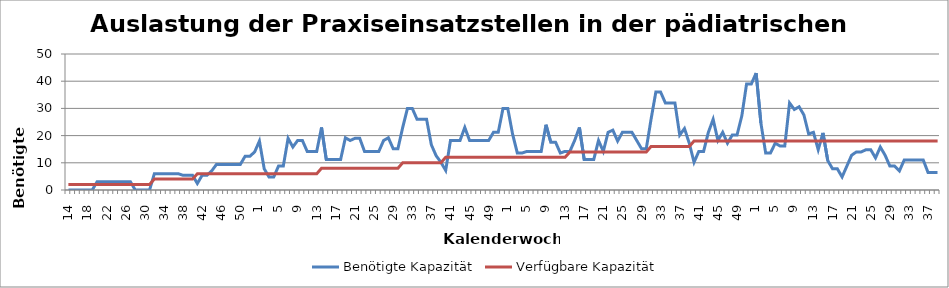
| Category | Benötigte Kapazität | Verfügbare Kapazität |
|---|---|---|
| 14.0 | 0 | 2 |
| 15.0 | 0 | 2 |
| 16.0 | 0 | 2 |
| 17.0 | 0 | 2 |
| 18.0 | 0 | 2 |
| 19.0 | 0 | 2 |
| 20.0 | 3 | 2 |
| 21.0 | 3 | 2 |
| 22.0 | 3 | 2 |
| 23.0 | 3 | 2 |
| 24.0 | 3 | 2 |
| 25.0 | 3 | 2 |
| 26.0 | 3 | 2 |
| 27.0 | 3 | 2 |
| 28.0 | 0 | 2 |
| 29.0 | 0 | 2 |
| 30.0 | 0 | 2 |
| 31.0 | 0 | 2 |
| 32.0 | 6 | 4 |
| 33.0 | 6 | 4 |
| 34.0 | 6 | 4 |
| 35.0 | 6 | 4 |
| 36.0 | 6 | 4 |
| 37.0 | 6 | 4 |
| 38.0 | 5.4 | 4 |
| 39.0 | 5.4 | 4 |
| 40.0 | 5.4 | 4 |
| 41.0 | 2.4 | 6 |
| 42.0 | 5.4 | 6 |
| 43.0 | 5.4 | 6 |
| 44.0 | 7 | 6 |
| 45.0 | 9.4 | 6 |
| 46.0 | 9.4 | 6 |
| 47.0 | 9.4 | 6 |
| 48.0 | 9.4 | 6 |
| 49.0 | 9.4 | 6 |
| 50.0 | 9.4 | 6 |
| 51.0 | 12.4 | 6 |
| 52.0 | 12.4 | 6 |
| 53.0 | 14 | 6 |
| 1.0 | 18 | 6 |
| 2.0 | 7.8 | 6 |
| 3.0 | 4.8 | 6 |
| 4.0 | 4.8 | 6 |
| 5.0 | 8.8 | 6 |
| 6.0 | 8.8 | 6 |
| 7.0 | 19 | 6 |
| 8.0 | 15.8 | 6 |
| 9.0 | 18.2 | 6 |
| 10.0 | 18.2 | 6 |
| 11.0 | 14.2 | 6 |
| 12.0 | 14.2 | 6 |
| 13.0 | 14.2 | 6 |
| 14.0 | 23 | 8 |
| 15.0 | 11.2 | 8 |
| 16.0 | 11.2 | 8 |
| 17.0 | 11.2 | 8 |
| 18.0 | 11.2 | 8 |
| 19.0 | 19.2 | 8 |
| 20.0 | 18.2 | 8 |
| 21.0 | 19 | 8 |
| 22.0 | 19 | 8 |
| 23.0 | 14.2 | 8 |
| 24.0 | 14.2 | 8 |
| 25.0 | 14.2 | 8 |
| 26.0 | 14.2 | 8 |
| 27.0 | 18.2 | 8 |
| 28.0 | 19.2 | 8 |
| 29.0 | 15.2 | 8 |
| 30.0 | 15.2 | 8 |
| 31.0 | 23 | 10 |
| 32.0 | 30 | 10 |
| 33.0 | 30 | 10 |
| 34.0 | 26 | 10 |
| 35.0 | 26 | 10 |
| 36.0 | 26 | 10 |
| 37.0 | 16.6 | 10 |
| 38.0 | 12.6 | 10 |
| 39.0 | 10.2 | 10 |
| 40.0 | 7.2 | 12 |
| 41.0 | 18.2 | 12 |
| 42.0 | 18.2 | 12 |
| 43.0 | 18.2 | 12 |
| 44.0 | 23 | 12 |
| 45.0 | 18.2 | 12 |
| 46.0 | 18.2 | 12 |
| 47.0 | 18.2 | 12 |
| 48.0 | 18.2 | 12 |
| 49.0 | 18.2 | 12 |
| 50.0 | 21.2 | 12 |
| 51.0 | 21.2 | 12 |
| 52.0 | 30 | 12 |
| 1.0 | 30 | 12 |
| 2.0 | 20.6 | 12 |
| 3.0 | 13.6 | 12 |
| 4.0 | 13.6 | 12 |
| 5.0 | 14.2 | 12 |
| 6.0 | 14.2 | 12 |
| 7.0 | 14.2 | 12 |
| 8.0 | 14.2 | 12 |
| 9.0 | 24 | 12 |
| 10.0 | 17.6 | 12 |
| 11.0 | 17.6 | 12 |
| 12.0 | 13.6 | 12 |
| 13.0 | 14.2 | 12 |
| 14.0 | 14.2 | 14 |
| 15.0 | 18.2 | 14 |
| 16.0 | 23 | 14 |
| 17.0 | 11.2 | 14 |
| 18.0 | 11.2 | 14 |
| 19.0 | 11.2 | 14 |
| 20.0 | 18.2 | 14 |
| 21.0 | 14.2 | 14 |
| 22.0 | 21.2 | 14 |
| 23.0 | 22 | 14 |
| 24.0 | 18 | 14 |
| 25.0 | 21.2 | 14 |
| 26.0 | 21.2 | 14 |
| 27.0 | 21.2 | 14 |
| 28.0 | 18.2 | 14 |
| 29.0 | 15.2 | 14 |
| 30.0 | 15.2 | 14 |
| 31.0 | 26 | 16 |
| 32.0 | 36 | 16 |
| 33.0 | 36 | 16 |
| 34.0 | 32 | 16 |
| 35.0 | 32 | 16 |
| 36.0 | 32 | 16 |
| 37.0 | 20.2 | 16 |
| 38.0 | 22.6 | 16 |
| 39.0 | 17.2 | 16 |
| 40.0 | 10.2 | 18 |
| 41.0 | 14.2 | 18 |
| 42.0 | 14.2 | 18 |
| 43.0 | 21.2 | 18 |
| 44.0 | 26 | 18 |
| 45.0 | 18.2 | 18 |
| 46.0 | 21.2 | 18 |
| 47.0 | 17.2 | 18 |
| 48.0 | 20.2 | 18 |
| 49.0 | 20.2 | 18 |
| 50.0 | 27.2 | 18 |
| 51.0 | 39 | 18 |
| 52.0 | 39 | 18 |
| 1.0 | 43 | 18 |
| 2.0 | 24.6 | 18 |
| 3.0 | 13.6 | 18 |
| 4.0 | 13.6 | 18 |
| 5.0 | 17.2 | 18 |
| 6.0 | 16.2 | 18 |
| 7.0 | 16.2 | 18 |
| 8.0 | 32 | 18 |
| 9.0 | 29.6 | 18 |
| 10.0 | 30.6 | 18 |
| 11.0 | 27.6 | 18 |
| 12.0 | 20.6 | 18 |
| 13.0 | 21.2 | 18 |
| 14.0 | 14.8 | 18 |
| 15.0 | 21 | 18 |
| 16.0 | 10.8 | 18 |
| 17.0 | 7.8 | 18 |
| 18.0 | 7.8 | 18 |
| 19.0 | 4.8 | 18 |
| 20.0 | 8.8 | 18 |
| 21.0 | 12.8 | 18 |
| 22.0 | 14 | 18 |
| 23.0 | 14 | 18 |
| 24.0 | 14.8 | 18 |
| 25.0 | 14.8 | 18 |
| 26.0 | 11.8 | 18 |
| 27.0 | 15.8 | 18 |
| 28.0 | 12.8 | 18 |
| 29.0 | 8.8 | 18 |
| 30.0 | 8.8 | 18 |
| 31.0 | 7 | 18 |
| 32.0 | 11 | 18 |
| 33.0 | 11 | 18 |
| 34.0 | 11 | 18 |
| 35.0 | 11 | 18 |
| 36.0 | 11 | 18 |
| 37.0 | 6.4 | 18 |
| 38.0 | 6.4 | 18 |
| 39.0 | 6.4 | 18 |